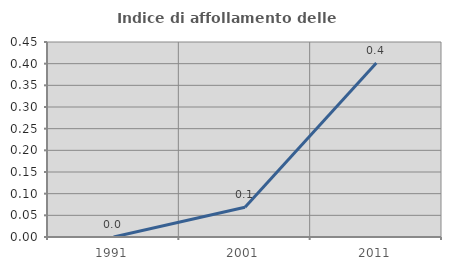
| Category | Indice di affollamento delle abitazioni  |
|---|---|
| 1991.0 | 0 |
| 2001.0 | 0.069 |
| 2011.0 | 0.402 |